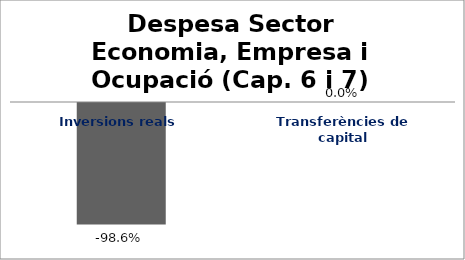
| Category | Series 0 |
|---|---|
| Inversions reals | -0.986 |
| Transferències de capital | 0 |